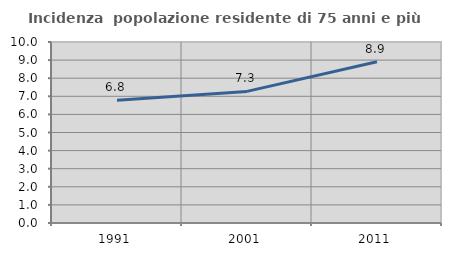
| Category | Incidenza  popolazione residente di 75 anni e più |
|---|---|
| 1991.0 | 6.788 |
| 2001.0 | 7.271 |
| 2011.0 | 8.911 |